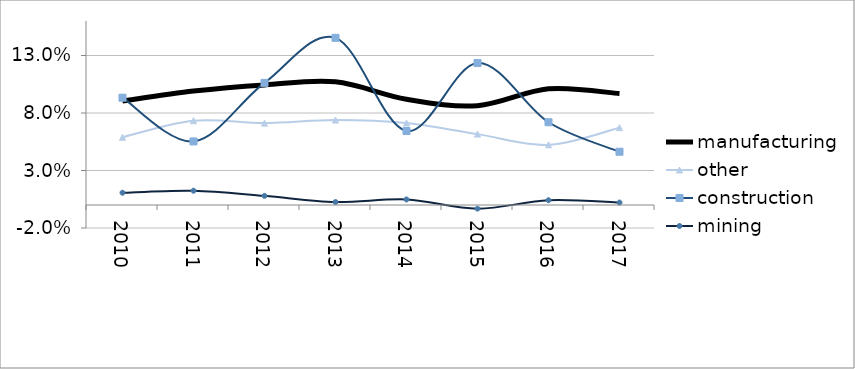
| Category | manufacturing | other | construction | mining |
|---|---|---|---|---|
| 2010.0 | 0.09 | 0.059 | 0.093 | 0.011 |
| 2011.0 | 0.099 | 0.073 | 0.055 | 0.012 |
| 2012.0 | 0.104 | 0.071 | 0.106 | 0.008 |
| 2013.0 | 0.107 | 0.074 | 0.145 | 0.003 |
| 2014.0 | 0.092 | 0.071 | 0.064 | 0.005 |
| 2015.0 | 0.086 | 0.062 | 0.123 | -0.003 |
| 2016.0 | 0.101 | 0.052 | 0.072 | 0.004 |
| 2017.0 | 0.097 | 0.067 | 0.046 | 0.002 |